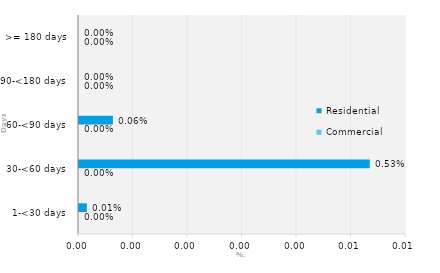
| Category | Commercial | Residential |
|---|---|---|
| 1-<30 days | 0 | 0 |
| 30-<60 days | 0 | 0.005 |
| 60-<90 days | 0 | 0.001 |
| 90-<180 days | 0 | 0 |
| >= 180 days | 0 | 0 |